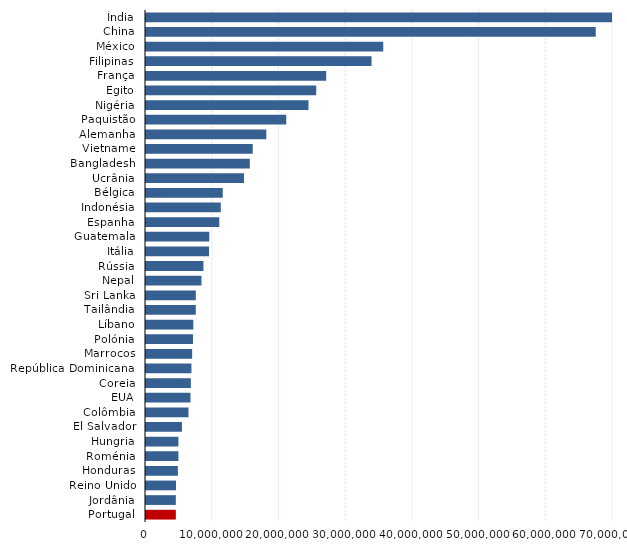
| Category | Series 2 |
|---|---|
| Índia | 78609170.432 |
| China | 67413594.112 |
| México | 35561611.008 |
| Filipinas | 33808970.24 |
| França | 27011081.024 |
| Egito | 25515700.224 |
| Nigéria | 24356146.131 |
| Paquistão | 21021999.232 |
| Alemanha | 18034549.168 |
| Vietname | 16000000 |
| Bangladesh | 15562379.52 |
| Ucrânia | 14693999.616 |
| Bélgica | 11505420.224 |
| Indonésia | 11211910.368 |
| Espanha | 10985875.2 |
| Guatemala | 9490600.416 |
| Itália | 9443089.92 |
| Rússia | 8610210.048 |
| Nepal | 8316186.428 |
| Sri Lanka | 7465619.987 |
| Tailândia | 7463329.92 |
| Líbano | 7093484.894 |
| Polónia | 7043000.064 |
| Marrocos | 6918199.808 |
| República Dominicana  | 6814199.808 |
| Coreia | 6722700.16 |
| EUA | 6668000.256 |
| Colômbia | 6367490.048 |
| El Salvador | 5388140.16 |
| Hungria | 4860160.128 |
| Roménia | 4856430.08 |
| Honduras | 4776549.824 |
| Reino Unido | 4498890.112 |
| Jordânia | 4470139.904 |
| Portugal | 4469808.384 |